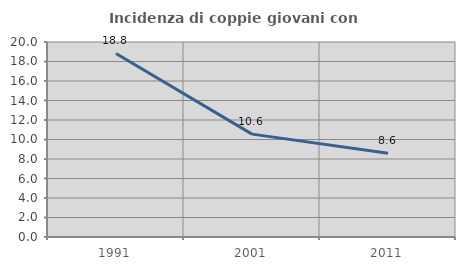
| Category | Incidenza di coppie giovani con figli |
|---|---|
| 1991.0 | 18.821 |
| 2001.0 | 10.55 |
| 2011.0 | 8.6 |